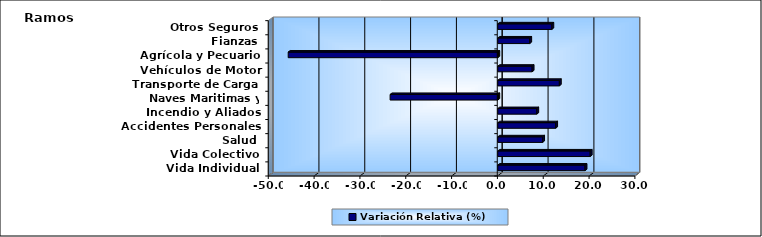
| Category | Variación Relativa (%) |
|---|---|
| Vida Individual | 19.037 |
| Vida Colectivo | 20.165 |
| Salud | 9.781 |
| Accidentes Personales | 12.625 |
| Incendio y Aliados | 8.501 |
| Naves Maritimas y Aéreas | -23.498 |
| Transporte de Carga | 13.434 |
| Vehículos de Motor | 7.493 |
| Agrícola y Pecuario | -45.736 |
| Fianzas | 6.969 |
| Otros Seguros | 11.792 |